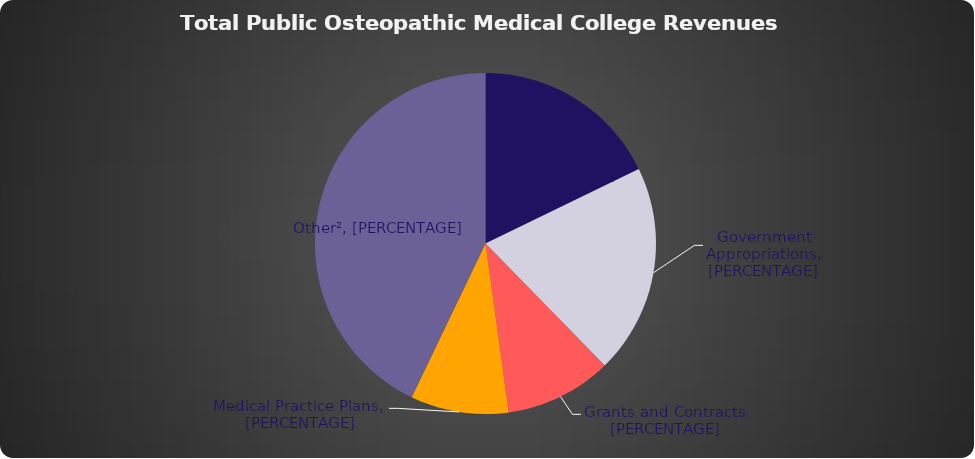
| Category | Series 0 |
|---|---|
| 0 | 191043831 |
| 1 | 213673649 |
| 2 | 108752207 |
| 3 | 100027330 |
| 4 | 460339185 |